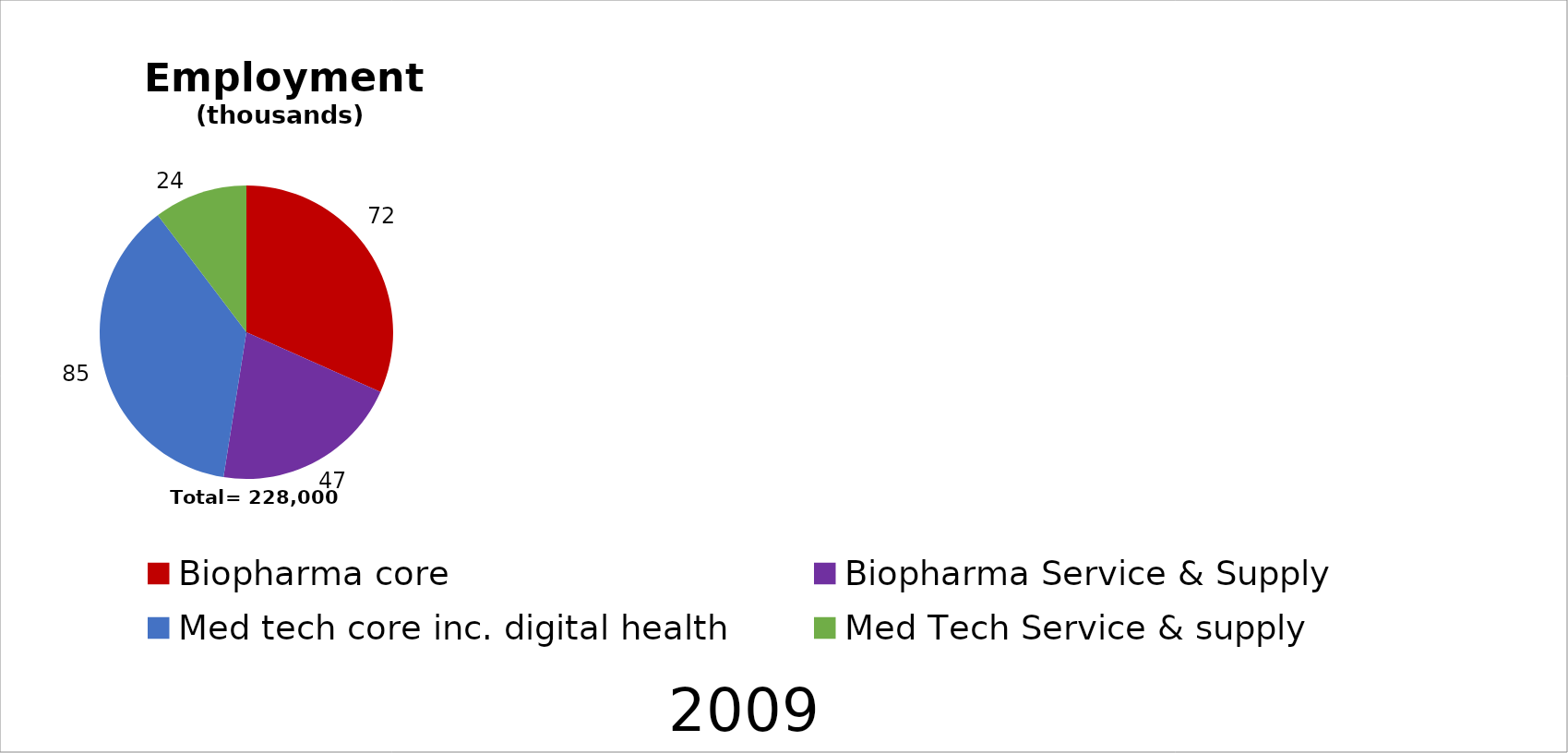
| Category | Series 0 |
|---|---|
| Biopharma core | 72.154 |
| Biopharma Service & Supply | 47.467 |
| Med tech core inc. digital health | 84.717 |
| Med Tech Service & supply | 23.517 |